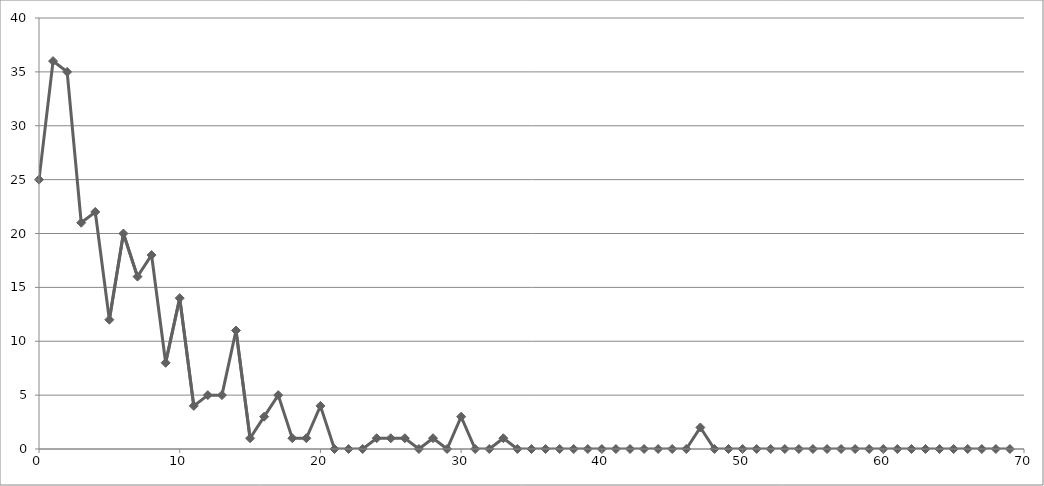
| Category | Series 0 |
|---|---|
| 0.0 | 25 |
| 1.0 | 36 |
| 2.0 | 35 |
| 3.0 | 21 |
| 4.0 | 22 |
| 5.0 | 12 |
| 6.0 | 20 |
| 7.0 | 16 |
| 8.0 | 18 |
| 9.0 | 8 |
| 10.0 | 14 |
| 11.0 | 4 |
| 12.0 | 5 |
| 13.0 | 5 |
| 14.0 | 11 |
| 15.0 | 1 |
| 16.0 | 3 |
| 17.0 | 5 |
| 18.0 | 1 |
| 19.0 | 1 |
| 20.0 | 4 |
| 21.0 | 0 |
| 22.0 | 0 |
| 23.0 | 0 |
| 24.0 | 1 |
| 25.0 | 1 |
| 26.0 | 1 |
| 27.0 | 0 |
| 28.0 | 1 |
| 29.0 | 0 |
| 30.0 | 3 |
| 31.0 | 0 |
| 32.0 | 0 |
| 33.0 | 1 |
| 34.0 | 0 |
| 35.0 | 0 |
| 36.0 | 0 |
| 37.0 | 0 |
| 38.0 | 0 |
| 39.0 | 0 |
| 40.0 | 0 |
| 41.0 | 0 |
| 42.0 | 0 |
| 43.0 | 0 |
| 44.0 | 0 |
| 45.0 | 0 |
| 46.0 | 0 |
| 47.0 | 2 |
| 48.0 | 0 |
| 49.0 | 0 |
| 50.0 | 0 |
| 51.0 | 0 |
| 52.0 | 0 |
| 53.0 | 0 |
| 54.0 | 0 |
| 55.0 | 0 |
| 56.0 | 0 |
| 57.0 | 0 |
| 58.0 | 0 |
| 59.0 | 0 |
| 60.0 | 0 |
| 61.0 | 0 |
| 62.0 | 0 |
| 63.0 | 0 |
| 64.0 | 0 |
| 65.0 | 0 |
| 66.0 | 0 |
| 67.0 | 0 |
| 68.0 | 0 |
| 69.0 | 0 |